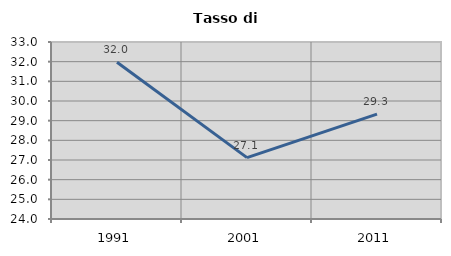
| Category | Tasso di disoccupazione   |
|---|---|
| 1991.0 | 31.97 |
| 2001.0 | 27.123 |
| 2011.0 | 29.335 |